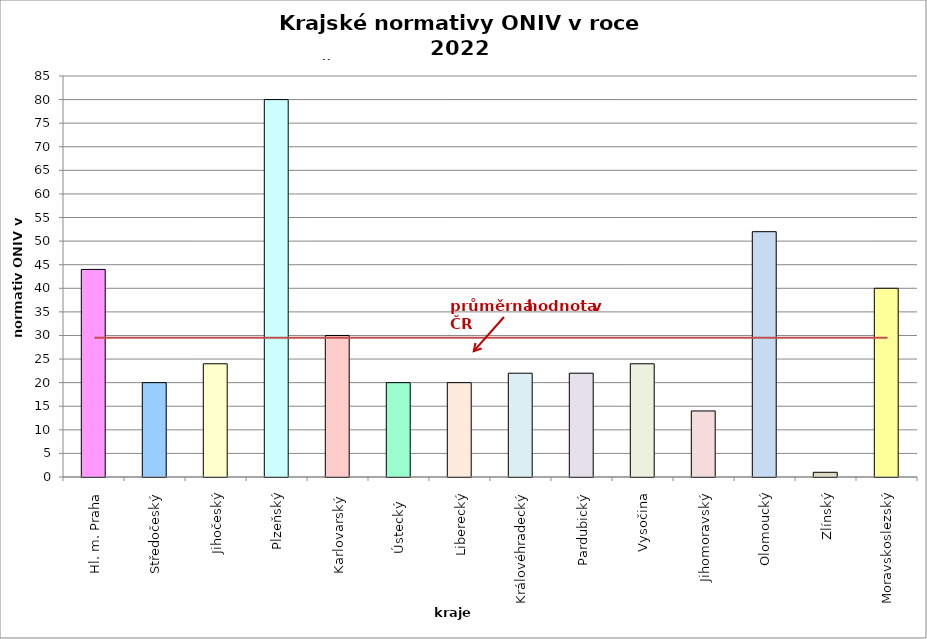
| Category | Series 0 |
|---|---|
| Hl. m. Praha | 44 |
| Středočeský | 20 |
| Jihočeský | 24 |
| Plzeňský | 80 |
| Karlovarský  | 30 |
| Ústecký   | 20 |
| Liberecký | 20 |
| Královéhradecký | 22 |
| Pardubický | 22 |
| Vysočina | 24 |
| Jihomoravský | 14 |
| Olomoucký | 52 |
| Zlínský | 1 |
| Moravskoslezský | 40 |